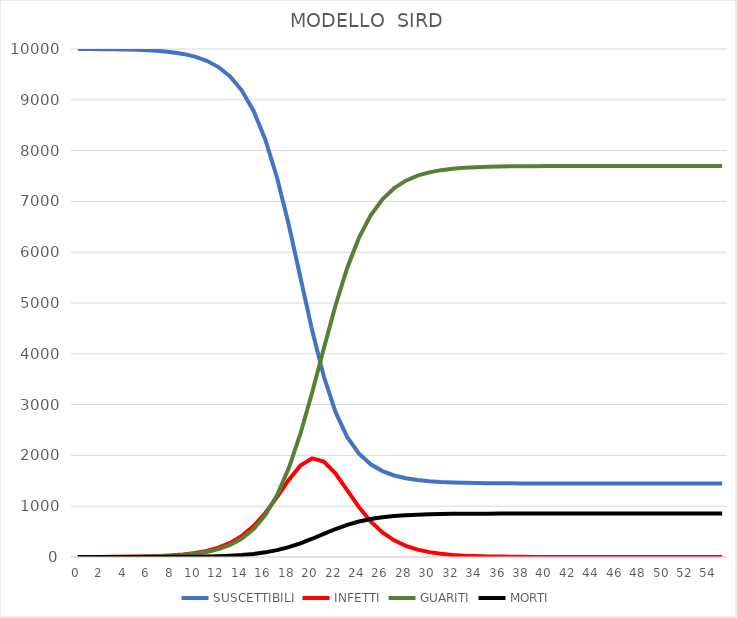
| Category | SUSCETTIBILI | INFETTI | GUARITI | MORTI |
|---|---|---|---|---|
| 0.0 | 9999 | 1 | 0 | 0 |
| 1.0 | 9997.95 | 1.55 | 0.45 | 0.05 |
| 2.0 | 9996.323 | 2.402 | 1.148 | 0.128 |
| 3.0 | 9993.801 | 3.723 | 2.229 | 0.248 |
| 4.0 | 9989.894 | 5.769 | 3.904 | 0.434 |
| 5.0 | 9983.842 | 8.936 | 6.5 | 0.722 |
| 6.0 | 9974.474 | 13.836 | 10.521 | 1.169 |
| 7.0 | 9959.982 | 21.41 | 16.747 | 1.861 |
| 8.0 | 9937.589 | 33.098 | 26.382 | 2.931 |
| 9.0 | 9903.049 | 51.089 | 41.276 | 4.586 |
| 10.0 | 9849.921 | 78.673 | 64.266 | 7.141 |
| 11.0 | 9768.546 | 120.711 | 99.669 | 11.074 |
| 12.0 | 9644.72 | 184.181 | 153.989 | 17.11 |
| 13.0 | 9458.182 | 278.629 | 236.87 | 26.319 |
| 14.0 | 9181.445 | 416.051 | 362.254 | 40.25 |
| 15.0 | 8780.31 | 609.161 | 549.477 | 61.053 |
| 16.0 | 8218.648 | 866.242 | 823.599 | 91.511 |
| 17.0 | 7471.043 | 1180.726 | 1213.408 | 134.823 |
| 18.0 | 6544.719 | 1516.687 | 1744.734 | 193.859 |
| 19.0 | 5502.354 | 1800.709 | 2427.244 | 269.694 |
| 20.0 | 4461.896 | 1940.813 | 3237.563 | 359.729 |
| 21.0 | 3552.536 | 1879.766 | 4110.928 | 456.77 |
| 22.0 | 2851.282 | 1641.136 | 4956.823 | 550.758 |
| 23.0 | 2359.902 | 1311.948 | 5695.334 | 632.815 |
| 24.0 | 2034.782 | 981.094 | 6285.711 | 698.412 |
| 25.0 | 1825.149 | 700.181 | 6727.204 | 747.467 |
| 26.0 | 1690.952 | 484.287 | 7042.285 | 782.476 |
| 27.0 | 1604.958 | 328.137 | 7260.214 | 806.69 |
| 28.0 | 1549.655 | 219.372 | 7407.876 | 823.097 |
| 29.0 | 1513.956 | 145.384 | 7506.593 | 834.066 |
| 30.0 | 1490.843 | 95.806 | 7572.016 | 841.335 |
| 31.0 | 1475.844 | 62.902 | 7615.129 | 846.125 |
| 32.0 | 1466.096 | 41.199 | 7643.434 | 849.27 |
| 33.0 | 1459.753 | 26.942 | 7661.974 | 851.33 |
| 34.0 | 1455.623 | 17.601 | 7674.098 | 852.678 |
| 35.0 | 1452.933 | 11.491 | 7682.019 | 853.558 |
| 36.0 | 1451.179 | 7.499 | 7687.19 | 854.132 |
| 37.0 | 1450.037 | 4.892 | 7690.564 | 854.507 |
| 38.0 | 1449.292 | 3.191 | 7692.766 | 854.752 |
| 39.0 | 1448.806 | 2.081 | 7694.202 | 854.911 |
| 40.0 | 1448.489 | 1.357 | 7695.138 | 855.015 |
| 41.0 | 1448.283 | 0.885 | 7695.749 | 855.083 |
| 42.0 | 1448.148 | 0.577 | 7696.147 | 855.127 |
| 43.0 | 1448.061 | 0.376 | 7696.407 | 855.156 |
| 44.0 | 1448.003 | 0.245 | 7696.576 | 855.175 |
| 45.0 | 1447.966 | 0.16 | 7696.686 | 855.187 |
| 46.0 | 1447.942 | 0.104 | 7696.758 | 855.195 |
| 47.0 | 1447.926 | 0.068 | 7696.805 | 855.201 |
| 48.0 | 1447.916 | 0.044 | 7696.836 | 855.204 |
| 49.0 | 1447.909 | 0.029 | 7696.856 | 855.206 |
| 50.0 | 1447.904 | 0.019 | 7696.869 | 855.208 |
| 51.0 | 1447.902 | 0.012 | 7696.878 | 855.209 |
| 52.0 | 1447.9 | 0.008 | 7696.883 | 855.209 |
| 53.0 | 1447.898 | 0.005 | 7696.887 | 855.21 |
| 54.0 | 1447.898 | 0.003 | 7696.889 | 855.21 |
| 55.0 | 1447.897 | 0.002 | 7696.891 | 855.21 |